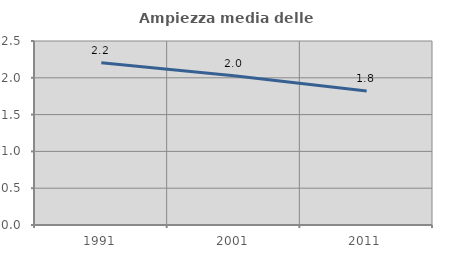
| Category | Ampiezza media delle famiglie |
|---|---|
| 1991.0 | 2.205 |
| 2001.0 | 2.027 |
| 2011.0 | 1.822 |